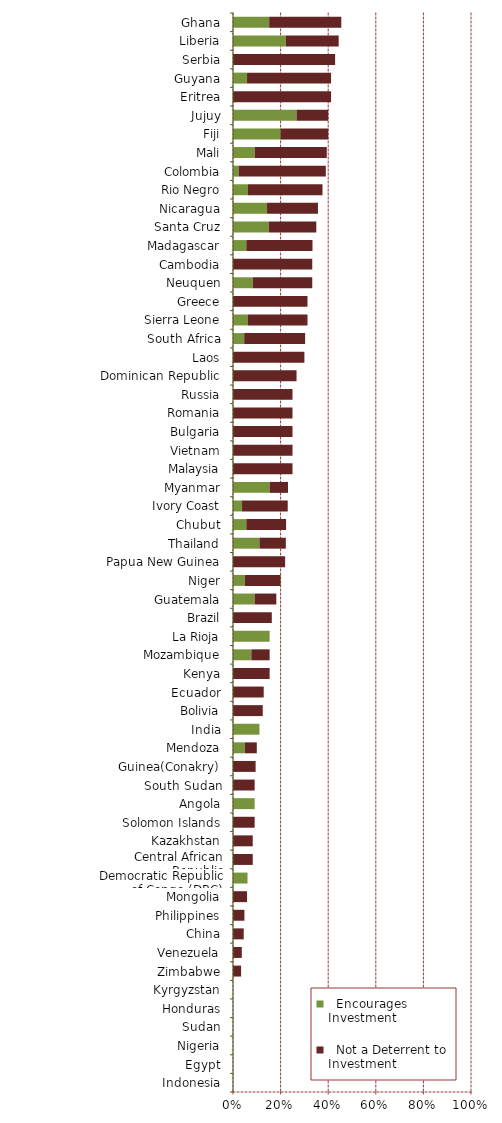
| Category |   Encourages Investment |   Not a Deterrent to Investment |
|---|---|---|
| Indonesia | 0 | 0 |
| Egypt | 0 | 0 |
| Nigeria | 0 | 0 |
| Sudan | 0 | 0 |
| Honduras | 0 | 0 |
| Kyrgyzstan | 0 | 0 |
| Zimbabwe | 0 | 0.034 |
| Venezuela | 0 | 0.037 |
| China | 0 | 0.045 |
| Philippines | 0 | 0.048 |
| Mongolia | 0 | 0.059 |
| Democratic Republic of Congo (DRC) | 0.061 | 0 |
| Central African Republic | 0 | 0.083 |
| Kazakhstan | 0 | 0.083 |
| Solomon Islands | 0 | 0.091 |
| Angola | 0.091 | 0 |
| South Sudan | 0 | 0.091 |
| Guinea(Conakry) | 0 | 0.095 |
| Mendoza | 0.05 | 0.05 |
| India | 0.111 | 0 |
| Bolivia | 0 | 0.125 |
| Ecuador | 0 | 0.129 |
| Kenya | 0 | 0.154 |
| Mozambique | 0.077 | 0.077 |
| La Rioja | 0.154 | 0 |
| Brazil | 0 | 0.163 |
| Guatemala | 0.091 | 0.091 |
| Niger | 0.05 | 0.15 |
| Papua New Guinea | 0 | 0.219 |
| Thailand | 0.111 | 0.111 |
| Chubut | 0.056 | 0.167 |
| Ivory Coast | 0.038 | 0.192 |
| Myanmar | 0.154 | 0.077 |
| Malaysia | 0 | 0.25 |
| Vietnam | 0 | 0.25 |
| Bulgaria | 0 | 0.25 |
| Romania | 0 | 0.25 |
| Russia | 0 | 0.25 |
| Dominican Republic | 0 | 0.267 |
| Laos | 0 | 0.3 |
| South Africa | 0.047 | 0.256 |
| Sierra Leone | 0.063 | 0.25 |
| Greece | 0 | 0.313 |
| Neuquen | 0.083 | 0.25 |
| Cambodia | 0 | 0.333 |
| Madagascar | 0.056 | 0.278 |
| Santa Cruz | 0.15 | 0.2 |
| Nicaragua | 0.143 | 0.214 |
| Rio Negro | 0.063 | 0.313 |
| Colombia | 0.024 | 0.366 |
| Mali | 0.091 | 0.303 |
| Fiji | 0.2 | 0.2 |
| Jujuy | 0.267 | 0.133 |
| Eritrea | 0 | 0.412 |
| Guyana | 0.059 | 0.353 |
| Serbia | 0 | 0.429 |
| Liberia | 0.222 | 0.222 |
| Ghana | 0.152 | 0.303 |